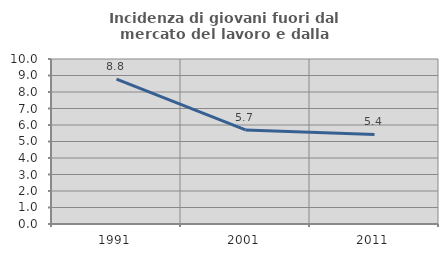
| Category | Incidenza di giovani fuori dal mercato del lavoro e dalla formazione  |
|---|---|
| 1991.0 | 8.78 |
| 2001.0 | 5.703 |
| 2011.0 | 5.426 |